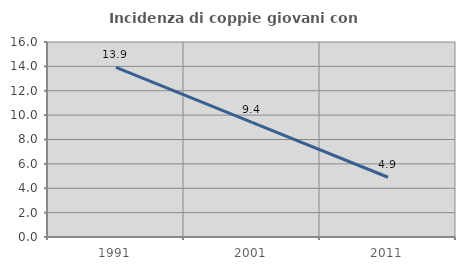
| Category | Incidenza di coppie giovani con figli |
|---|---|
| 1991.0 | 13.919 |
| 2001.0 | 9.409 |
| 2011.0 | 4.902 |